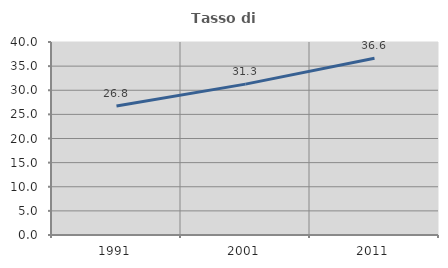
| Category | Tasso di occupazione   |
|---|---|
| 1991.0 | 26.756 |
| 2001.0 | 31.271 |
| 2011.0 | 36.613 |